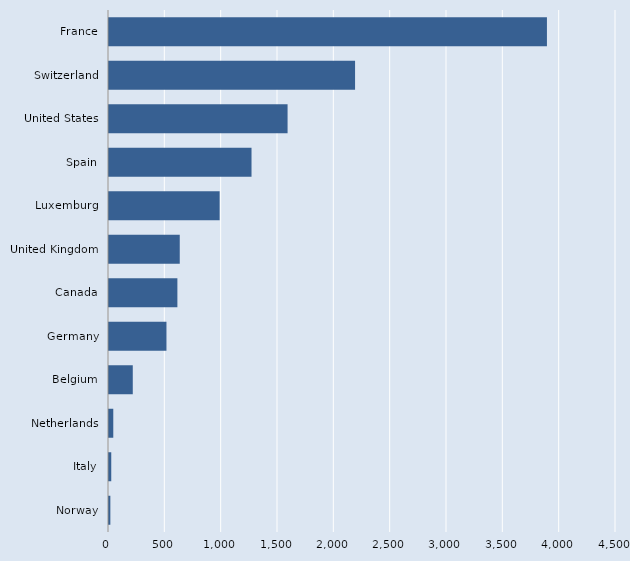
| Category | Series 0 |
|---|---|
| Norway | 12 |
| Italy | 20 |
| Netherlands | 38 |
| Belgium | 211 |
| Germany | 510 |
| Canada | 607 |
| United Kingdom | 628 |
| Luxemburg | 982 |
| Spain | 1265 |
| United States | 1585 |
| Switzerland | 2184 |
| France | 3887 |